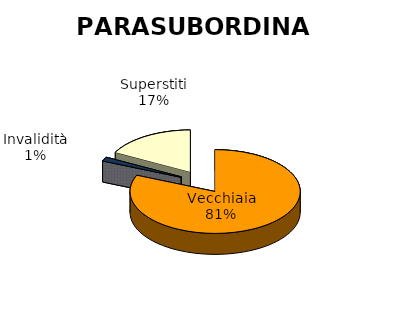
| Category | Parasubordinati |
|---|---|
| Vecchiaia | 15862 |
| Anz.tà/ Anticipate | 0 |
| Invalidità | 276 |
| Superstiti | 3357 |